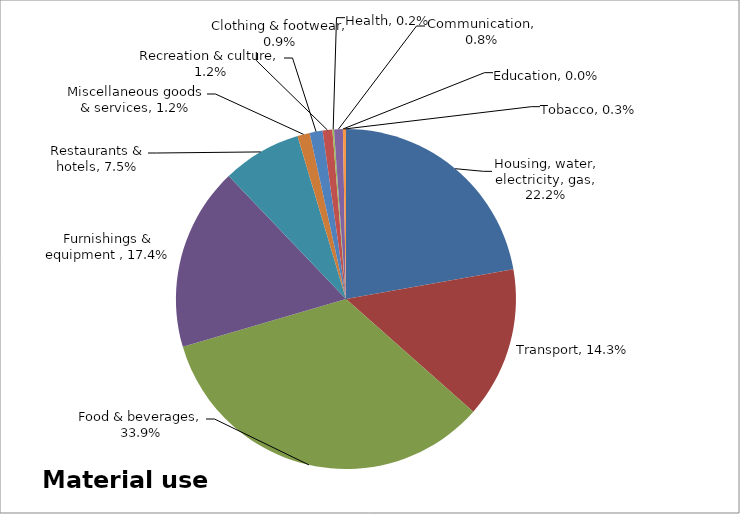
| Category | Material use (DMI) |
|---|---|
| Housing, water, electricity, gas | 0.222 |
| Transport | 0.143 |
| Food & beverages | 0.339 |
| Furnishings & equipment  | 0.174 |
| Restaurants & hotels | 0.075 |
| Miscellaneous goods & services | 0.012 |
| Recreation & culture | 0.012 |
| Clothing & footwear | 0.009 |
| Health | 0.002 |
| Communication | 0.008 |
| Education | 0 |
| Tobacco | 0.003 |